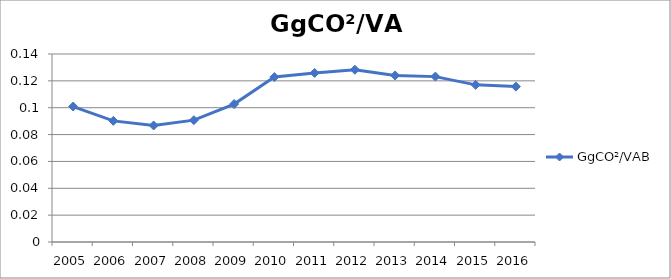
| Category | GgCO²/VAB |
|---|---|
| 2005.0 | 0.101 |
| 2006.0 | 0.09 |
| 2007.0 | 0.087 |
| 2008.0 | 0.091 |
| 2009.0 | 0.103 |
| 2010.0 | 0.123 |
| 2011.0 | 0.126 |
| 2012.0 | 0.128 |
| 2013.0 | 0.124 |
| 2014.0 | 0.123 |
| 2015.0 | 0.117 |
| 2016.0 | 0.116 |